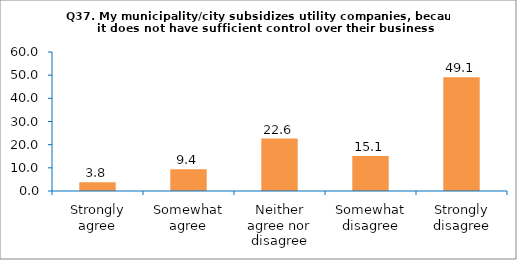
| Category | Series 0 |
|---|---|
| Strongly agree | 3.774 |
| Somewhat agree | 9.434 |
| Neither agree nor disagree | 22.642 |
| Somewhat disagree | 15.094 |
| Strongly disagree | 49.057 |